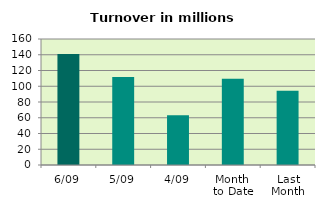
| Category | Series 0 |
|---|---|
| 6/09 | 140.926 |
| 5/09 | 111.899 |
| 4/09 | 63.257 |
| Month 
to Date | 109.599 |
| Last
Month | 94.334 |